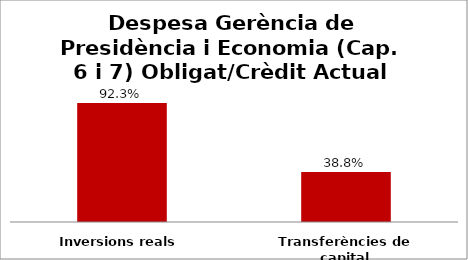
| Category | Series 0 |
|---|---|
| Inversions reals | 0.923 |
| Transferències de capital | 0.388 |